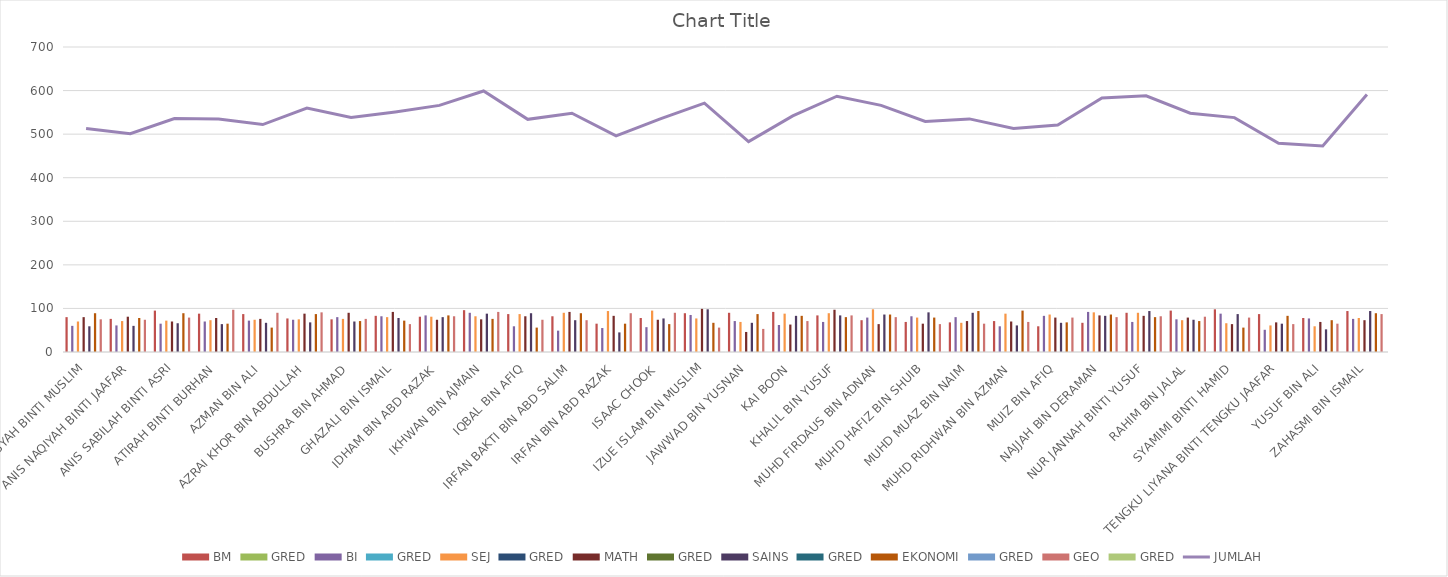
| Category | BM | GRED | BI | SEJ | MATH | SAINS | EKONOMI | GEO |
|---|---|---|---|---|---|---|---|---|
| AISYAH BINTI MUSLIM | 80 | 0 | 60 | 70 | 80 | 59 | 89 | 75 |
| ANIS NAQIYAH BINTI JAAFAR | 76 | 0 | 61 | 71 | 81 | 60 | 78 | 74 |
| ANIS SABILAH BINTI ASRI | 95 | 0 | 65 | 72 | 70 | 66 | 89 | 79 |
| ATIRAH BINTI BURHAN | 88 | 0 | 70 | 73 | 78 | 64 | 65 | 97 |
| AZMAN BIN ALI | 87 | 0 | 72 | 74 | 76 | 67 | 56 | 90 |
| AZRAI KHOR BIN ABDULLAH | 77 | 0 | 74 | 75 | 88 | 68 | 87 | 91 |
| BUSHRA BIN AHMAD | 75 | 0 | 80 | 76 | 90 | 70 | 71 | 76 |
| GHAZALI BIN ISMAIL | 83 | 0 | 82 | 80 | 92 | 78 | 72 | 64 |
| IDHAM BIN ABD RAZAK | 81 | 0 | 84 | 81 | 74 | 80 | 84 | 82 |
| IKHWAN BIN AJMAIN | 96 | 0 | 90 | 82 | 75 | 88 | 76 | 92 |
| IQBAL BIN AFIQ | 87 | 0 | 59 | 87 | 82 | 89 | 56 | 74 |
| IRFAN BAKTI BIN ABD SALIM | 82 | 0 | 49 | 90 | 92 | 73 | 89 | 73 |
| IRFAN BIN ABD RAZAK | 65 | 0 | 55 | 94 | 83 | 45 | 65 | 89 |
| ISAAC CHOOK | 78 | 0 | 57 | 95 | 74 | 77 | 64 | 90 |
| IZUE ISLAM BIN MUSLIM | 89 | 0 | 85 | 77 | 99 | 98 | 67 | 56 |
| JAWWAD BIN YUSNAN | 90 | 0 | 71 | 69 | 46 | 67 | 87 | 53 |
| KAI BOON | 92 | 0 | 62 | 88 | 63 | 83 | 83 | 71 |
| KHALIL BIN YUSUF | 84 | 0 | 69 | 89 | 97 | 84 | 80 | 84 |
| MUHD FIRDAUS BIN ADNAN | 73 | 0 | 79 | 98 | 64 | 86 | 86 | 80 |
| MUHD HAFIZ BIN SHUIB | 69 | 0 | 82 | 79 | 65 | 91 | 79 | 64 |
| MUHD MUAZ BIN NAIM | 68 | 0 | 80 | 67 | 71 | 90 | 94 | 65 |
| MUHD RIDHWAN BIN AZMAN | 71 | 0 | 59 | 88 | 70 | 61 | 95 | 69 |
| MUIZ BIN AFIQ | 59 | 0 | 83 | 86 | 79 | 67 | 68 | 79 |
| NAJJAH BIN DERAMAN | 67 | 0 | 92 | 91 | 84 | 83 | 86 | 80 |
| NUR JANNAH BINTI YUSUF | 90 | 0 | 69 | 90 | 83 | 94 | 80 | 82 |
| RAHIM BIN JALAL | 95 | 0 | 75 | 73 | 79 | 74 | 71 | 81 |
| SYAMIMI BINTI HAMID | 98 | 0 | 88 | 66 | 64 | 87 | 56 | 79 |
| TENGKU LIYANA BINTI TENGKU JAAFAR | 87 | 0 | 51 | 61 | 68 | 65 | 83 | 64 |
| YUSUF BIN ALI | 78 | 0 | 77 | 59 | 69 | 52 | 73 | 65 |
| ZAHASMI BIN ISMAIL | 94 | 0 | 76 | 78 | 73 | 94 | 89 | 87 |